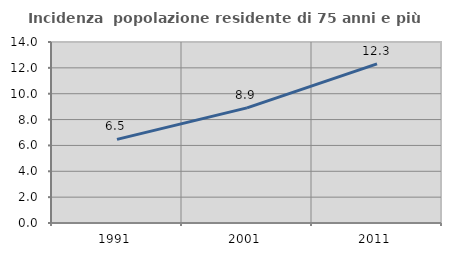
| Category | Incidenza  popolazione residente di 75 anni e più |
|---|---|
| 1991.0 | 6.471 |
| 2001.0 | 8.907 |
| 2011.0 | 12.302 |